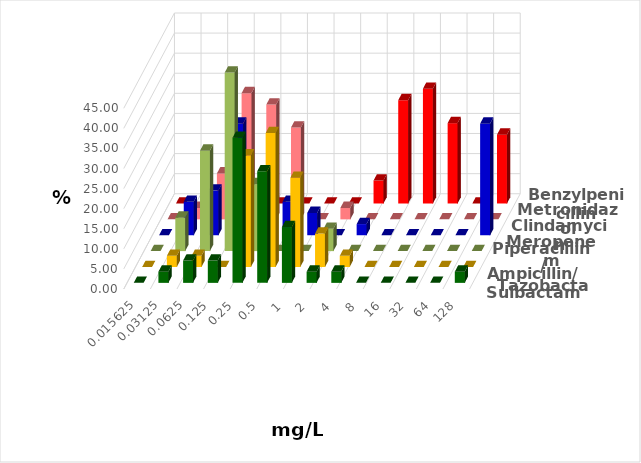
| Category | Ampicillin/ Sulbactam | Piperacillin/ Tazobactam | Meropenem | Clindamycin | Metronidazol | Benzylpenicillin |
|---|---|---|---|---|---|---|
| 0.015625 | 0 | 0 | 0 | 0 | 0 | 0 |
| 0.03125 | 2.778 | 2.778 | 8.333 | 8.333 | 2.857 | 0 |
| 0.0625 | 5.556 | 2.778 | 25 | 11.111 | 11.429 | 2.857 |
| 0.125 | 5.556 | 0 | 44.444 | 27.778 | 31.429 | 0 |
| 0.25 | 36.111 | 27.778 | 16.667 | 8.333 | 28.571 | 0 |
| 0.5 | 27.778 | 33.333 | 0 | 8.333 | 22.857 | 0 |
| 1.0 | 13.889 | 22.222 | 0 | 5.556 | 0 | 0 |
| 2.0 | 2.778 | 8.333 | 5.556 | 0 | 2.857 | 0 |
| 4.0 | 2.778 | 2.778 | 0 | 2.778 | 0 | 5.714 |
| 8.0 | 0 | 0 | 0 | 0 | 0 | 25.714 |
| 16.0 | 0 | 0 | 0 | 0 | 0 | 28.571 |
| 32.0 | 0 | 0 | 0 | 0 | 0 | 20 |
| 64.0 | 0 | 0 | 0 | 0 | 0 | 0 |
| 128.0 | 2.778 | 0 | 0 | 27.778 | 0 | 17.143 |